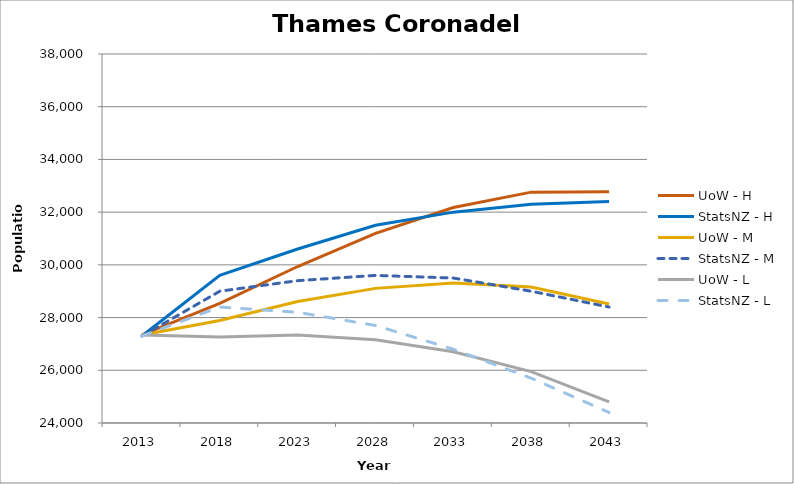
| Category | UoW - H | StatsNZ - H | UoW - M | StatsNZ - M | UoW - L | StatsNZ - L |
|---|---|---|---|---|---|---|
| 2013.0 | 27340 | 27300 | 27340 | 27300 | 27340 | 27300 |
| 2018.0 | 28538.102 | 29600 | 27892.155 | 29000 | 27261.932 | 28400 |
| 2023.0 | 29937.316 | 30600 | 28606.206 | 29400 | 27336.945 | 28200 |
| 2028.0 | 31193.986 | 31500 | 29108.029 | 29600 | 27161.707 | 27700 |
| 2033.0 | 32177.844 | 32000 | 29315.644 | 29500 | 26705.041 | 26800 |
| 2038.0 | 32759.387 | 32300 | 29159.027 | 29000 | 25948.564 | 25700 |
| 2043.0 | 32769.77 | 32400 | 28513.94 | 28400 | 24803.09 | 24400 |